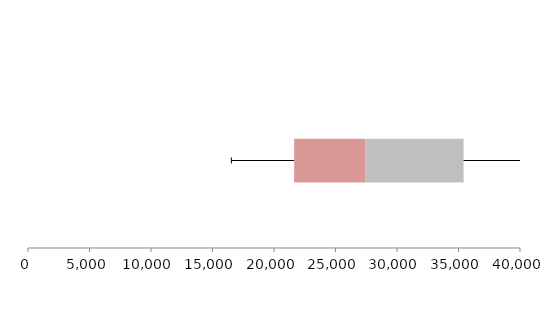
| Category | Series 1 | Series 2 | Series 3 |
|---|---|---|---|
| 0 | 21639.728 | 5809.574 | 7963.896 |